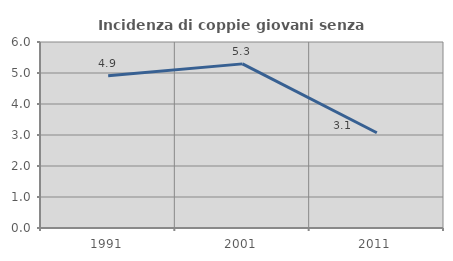
| Category | Incidenza di coppie giovani senza figli |
|---|---|
| 1991.0 | 4.91 |
| 2001.0 | 5.294 |
| 2011.0 | 3.072 |